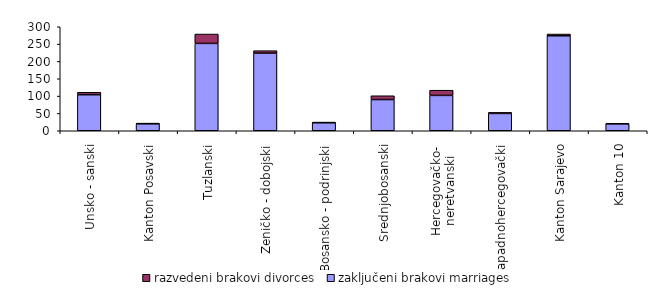
| Category | zaključeni brakovi marriages | razvedeni brakovi divorces |
|---|---|---|
| Unsko - sanski | 104 | 7 |
| Kanton Posavski | 20 | 2 |
| Tuzlanski | 252 | 27 |
| Zeničko - dobojski | 224 | 7 |
| Bosansko - podrinjski | 23 | 2 |
| Srednjobosanski | 90 | 11 |
| Hercegovačko-
neretvanski | 102 | 15 |
| Zapadnohercegovački | 50 | 3 |
| Kanton Sarajevo | 274 | 5 |
| Kanton 10 | 20 | 1 |